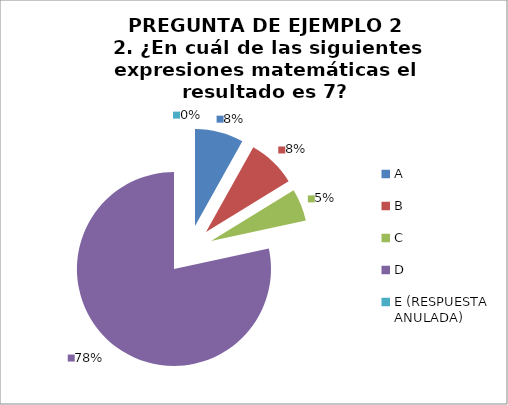
| Category | CANTIDAD DE RESPUESTAS PREGUNTA (2) | PORCENTAJE |
|---|---|---|
| A | 3 | 0.081 |
| B | 3 | 0.081 |
| C | 2 | 0.054 |
| D | 29 | 0.784 |
| E (RESPUESTA ANULADA) | 0 | 0 |